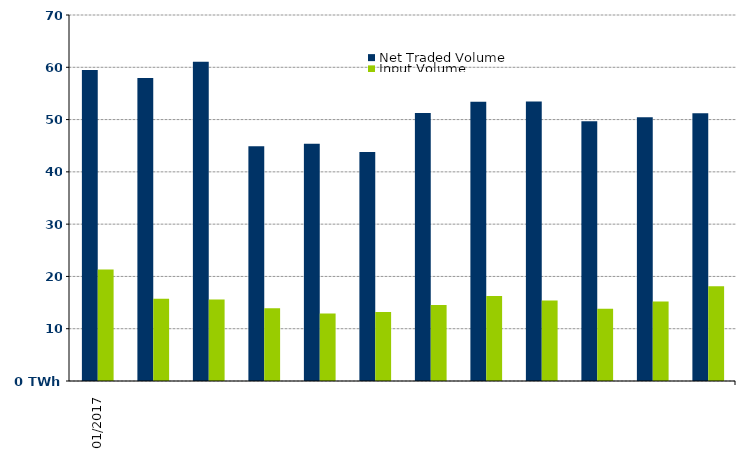
| Category | Net Traded Volume | Input Volume |
|---|---|---|
| 2017-01-01 | 59.459 | 21.306 |
| 2017-02-01 | 57.952 | 15.742 |
| 2017-03-01 | 61.08 | 15.572 |
| 2017-04-01 | 44.888 | 13.928 |
| 2017-05-01 | 45.386 | 12.904 |
| 2017-06-01 | 43.782 | 13.205 |
| 2017-07-01 | 51.238 | 14.515 |
| 2017-08-01 | 53.408 | 16.265 |
| 2017-09-01 | 53.436 | 15.389 |
| 2017-10-01 | 49.66 | 13.836 |
| 2017-11-01 | 50.446 | 15.207 |
| 2017-12-01 | 51.193 | 18.143 |